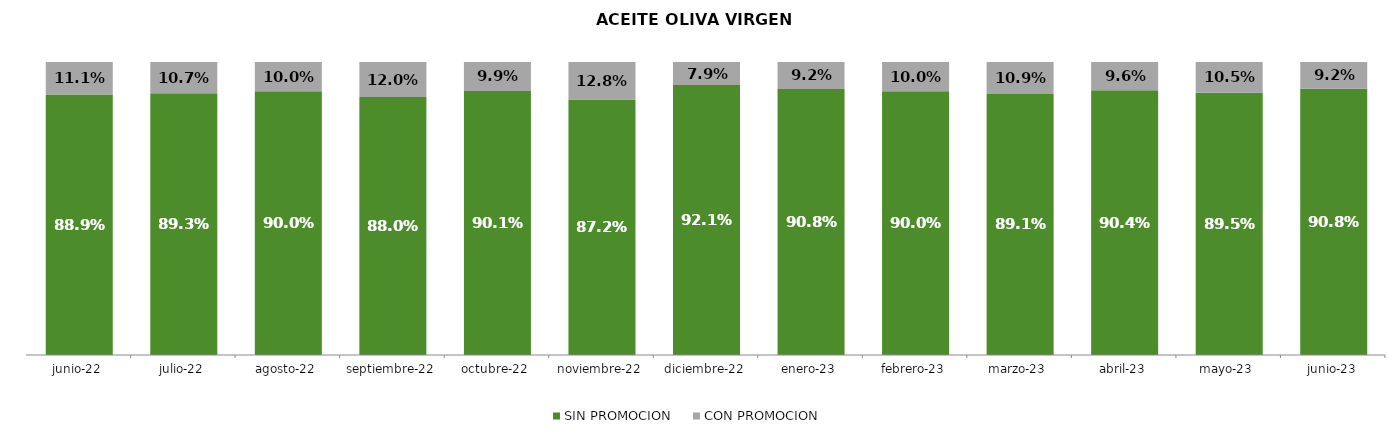
| Category | SIN PROMOCION   | CON PROMOCION   |
|---|---|---|
| 2022-06-01 | 0.889 | 0.111 |
| 2022-07-01 | 0.893 | 0.107 |
| 2022-08-01 | 0.9 | 0.1 |
| 2022-09-01 | 0.88 | 0.12 |
| 2022-10-01 | 0.901 | 0.099 |
| 2022-11-01 | 0.872 | 0.128 |
| 2022-12-01 | 0.921 | 0.079 |
| 2023-01-01 | 0.908 | 0.092 |
| 2023-02-01 | 0.9 | 0.1 |
| 2023-03-01 | 0.891 | 0.109 |
| 2023-04-01 | 0.904 | 0.096 |
| 2023-05-01 | 0.895 | 0.105 |
| 2023-06-01 | 0.908 | 0.092 |